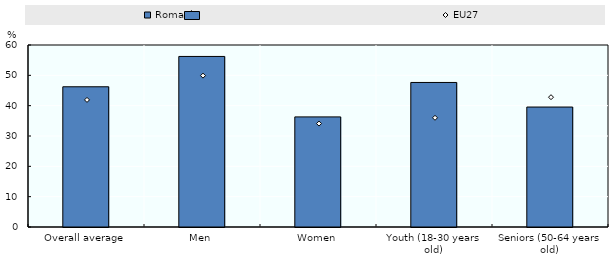
| Category | Romania |
|---|---|
| Overall average | 46.227 |
| Men | 56.226 |
| Women | 36.295 |
| Youth (18-30 years old) | 47.648 |
| Seniors (50-64 years old) | 39.548 |